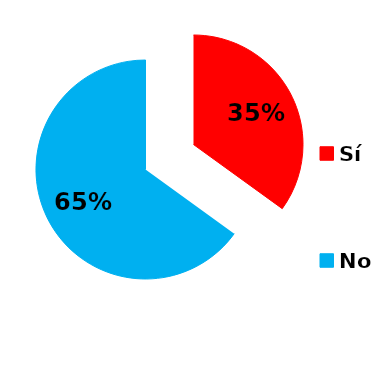
| Category | Series 0 |
|---|---|
| Sí | 179 |
| No | 333 |